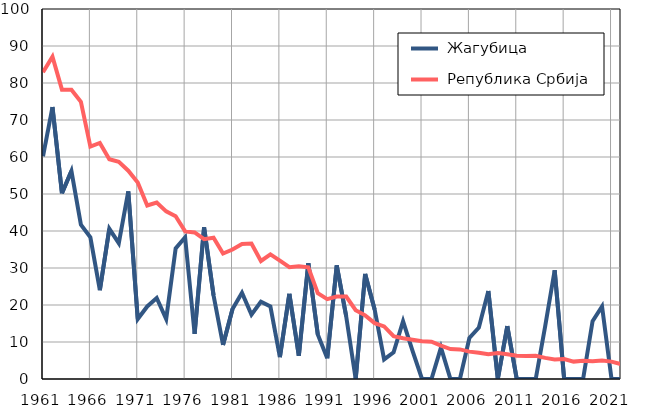
| Category |  Жагубица |  Република Србија |
|---|---|---|
| 1961.0 | 60.2 | 82.9 |
| 1962.0 | 73.5 | 87.1 |
| 1963.0 | 50.2 | 78.2 |
| 1964.0 | 56.2 | 78.2 |
| 1965.0 | 41.7 | 74.9 |
| 1966.0 | 38.3 | 62.8 |
| 1967.0 | 24 | 63.8 |
| 1968.0 | 40.6 | 59.4 |
| 1969.0 | 36.7 | 58.7 |
| 1970.0 | 50.7 | 56.3 |
| 1971.0 | 16.2 | 53.1 |
| 1972.0 | 19.6 | 46.9 |
| 1973.0 | 21.9 | 47.7 |
| 1974.0 | 16.2 | 45.3 |
| 1975.0 | 35.3 | 44 |
| 1976.0 | 38.3 | 39.9 |
| 1977.0 | 12.2 | 39.6 |
| 1978.0 | 41 | 37.8 |
| 1979.0 | 22.6 | 38.2 |
| 1980.0 | 9.2 | 33.9 |
| 1981.0 | 18.9 | 35 |
| 1982.0 | 23.3 | 36.5 |
| 1983.0 | 17.4 | 36.6 |
| 1984.0 | 20.9 | 31.9 |
| 1985.0 | 19.6 | 33.7 |
| 1986.0 | 5.9 | 32 |
| 1987.0 | 23 | 30.2 |
| 1988.0 | 6.3 | 30.5 |
| 1989.0 | 31.3 | 30.2 |
| 1990.0 | 12 | 23.2 |
| 1991.0 | 5.6 | 21.6 |
| 1992.0 | 30.7 | 22.3 |
| 1993.0 | 16.9 | 22.3 |
| 1994.0 | 0 | 18.6 |
| 1995.0 | 28.4 | 17.2 |
| 1996.0 | 18.8 | 15.1 |
| 1997.0 | 5.3 | 14.2 |
| 1998.0 | 7.2 | 11.6 |
| 1999.0 | 15.6 | 11 |
| 2000.0 | 7.6 | 10.6 |
| 2001.0 | 0 | 10.2 |
| 2002.0 | 0 | 10.1 |
| 2003.0 | 8.5 | 9 |
| 2004.0 | 0 | 8.1 |
| 2005.0 | 0 | 8 |
| 2006.0 | 11.1 | 7.4 |
| 2007.0 | 13.9 | 7.1 |
| 2008.0 | 23.8 | 6.7 |
| 2009.0 | 0 | 7 |
| 2010.0 | 14.3 | 6.7 |
| 2011.0 | 0 | 6.3 |
| 2012.0 | 0 | 6.2 |
| 2013.0 | 0 | 6.3 |
| 2014.0 | 14.3 | 5.7 |
| 2015.0 | 29.4 | 5.3 |
| 2016.0 | 0 | 5.4 |
| 2017.0 | 0 | 4.7 |
| 2018.0 | 0 | 4.9 |
| 2019.0 | 15.6 | 4.8 |
| 2020.0 | 19.6 | 5 |
| 2021.0 | 0 | 4.7 |
| 2022.0 | 0 | 4 |